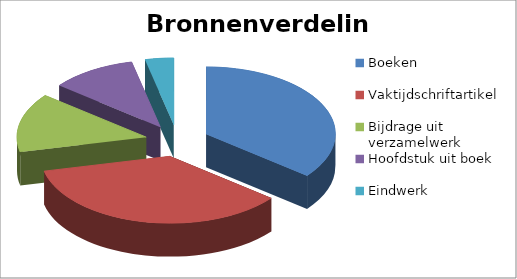
| Category | Series 0 |
|---|---|
| Boeken | 10 |
| Vaktijdschriftartikel | 10 |
| Bijdrage uit verzamelwerk | 4 |
| Hoofdstuk uit boek | 3 |
| Eindwerk | 1 |